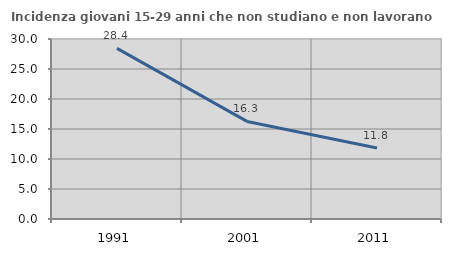
| Category | Incidenza giovani 15-29 anni che non studiano e non lavorano  |
|---|---|
| 1991.0 | 28.436 |
| 2001.0 | 16.265 |
| 2011.0 | 11.847 |